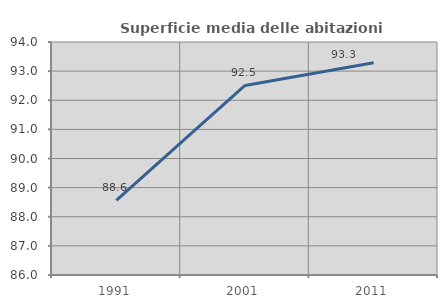
| Category | Superficie media delle abitazioni occupate |
|---|---|
| 1991.0 | 88.566 |
| 2001.0 | 92.508 |
| 2011.0 | 93.291 |